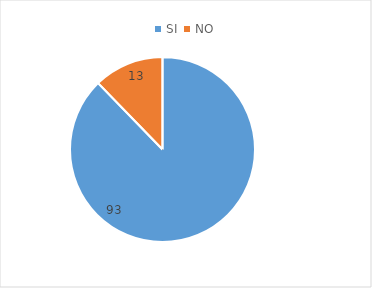
| Category | Series 0 |
|---|---|
| SI  | 93 |
| NO | 13 |